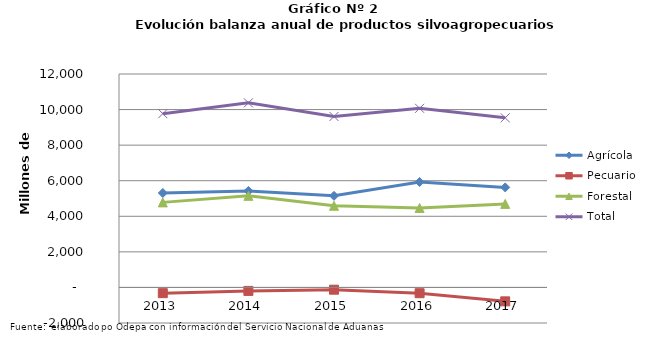
| Category | Agrícola | Pecuario | Forestal | Total |
|---|---|---|---|---|
| 2013.0 | 5309603 | -322473 | 4781973 | 9769103 |
| 2014.0 | 5424524 | -195643 | 5149868 | 10378749 |
| 2015.0 | 5149872 | -127785 | 4591408 | 9613495 |
| 2016.0 | 5928552 | -325380 | 4468104 | 10071276 |
| 2017.0 | 5622675 | -782960 | 4697401 | 9537116 |